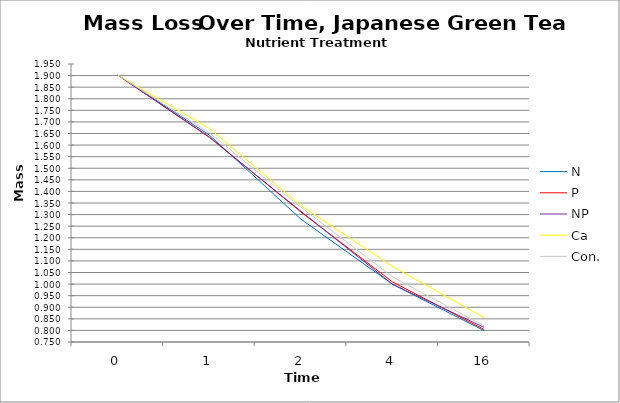
| Category | N | P | NP | Ca | Con. |
|---|---|---|---|---|---|
| 0.0 | 1.902 | 1.902 | 1.902 | 1.902 | 1.902 |
| 1.0 | 1.643 | 1.635 | 1.633 | 1.672 | 1.653 |
| 2.0 | 1.28 | 1.311 | 1.314 | 1.339 | 1.331 |
| 4.0 | 0.999 | 1.009 | 0.999 | 1.076 | 1.031 |
| 16.0 | 0.799 | 0.804 | 0.813 | 0.855 | 0.819 |